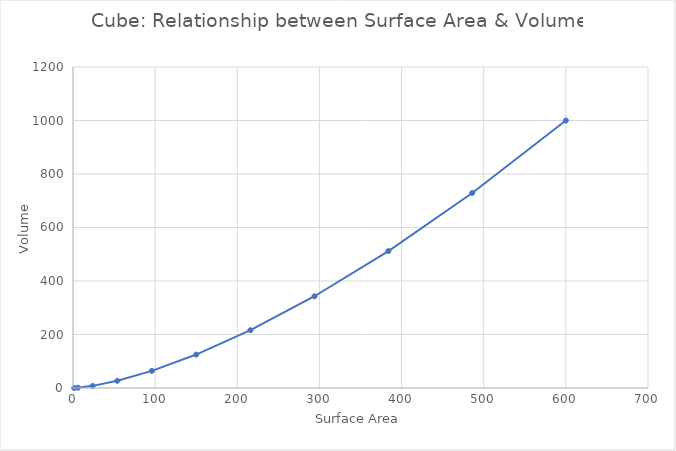
| Category | Series 0 |
|---|---|
| 1.5 | 0.125 |
| 6.0 | 1 |
| 24.0 | 8 |
| 54.0 | 27 |
| 96.0 | 64 |
| 150.0 | 125 |
| 216.0 | 216 |
| 294.0 | 343 |
| 384.0 | 512 |
| 486.0 | 729 |
| 600.0 | 1000 |